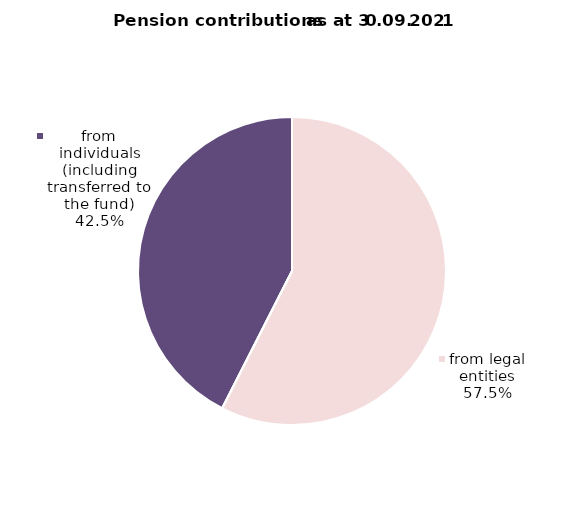
| Category | Series 0 |
|---|---|
| from legal entities | 878.872 |
| from individual entrepreneurs | 0.341 |
| from individuals (including transferred to the fund) | 649.829 |